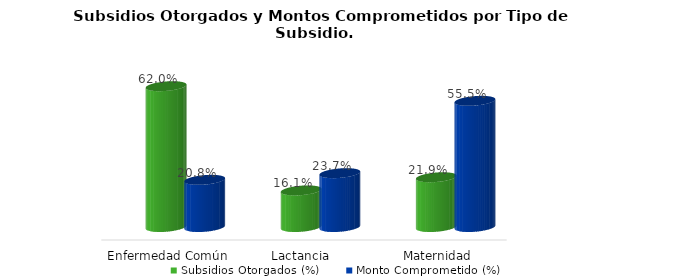
| Category | Subsidios Otorgados (%) | Monto Comprometido (%) |
|---|---|---|
| Enfermedad Común | 0.62 | 0.208 |
| Lactancia  | 0.161 | 0.237 |
| Maternidad | 0.219 | 0.555 |